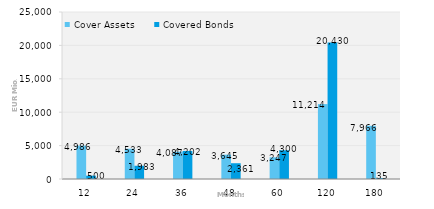
| Category | Cover Assets | Covered Bonds |
|---|---|---|
| 12.0 | 4986.047 | 500 |
| 24.0 | 4533.207 | 1983 |
| 36.0 | 4086.854 | 4202 |
| 48.0 | 3644.868 | 2361 |
| 60.0 | 3246.514 | 4300 |
| 120.0 | 11213.755 | 20430 |
| 180.0 | 7966.277 | 135 |